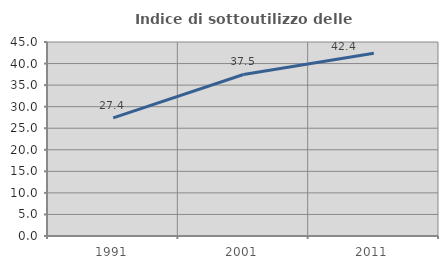
| Category | Indice di sottoutilizzo delle abitazioni  |
|---|---|
| 1991.0 | 27.405 |
| 2001.0 | 37.467 |
| 2011.0 | 42.384 |